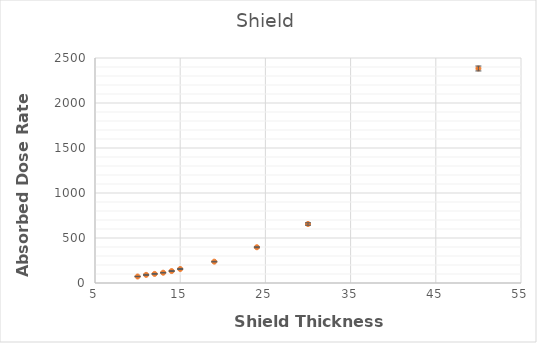
| Category | Shield |
|---|---|
| 10.0 | 72.136 |
| 11.0 | 90.459 |
| 12.0 | 100.82 |
| 13.0 | 114.291 |
| 14.0 | 132.69 |
| 15.0 | 155.762 |
| 19.0 | 237.08 |
| 24.0 | 397.393 |
| 30.0 | 655.554 |
| 50.0 | 2383.604 |